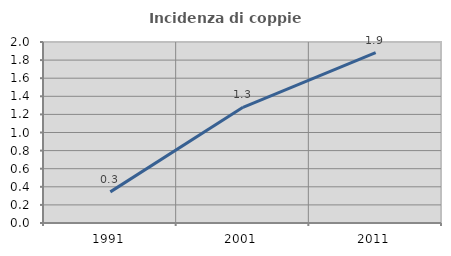
| Category | Incidenza di coppie miste |
|---|---|
| 1991.0 | 0.344 |
| 2001.0 | 1.278 |
| 2011.0 | 1.883 |